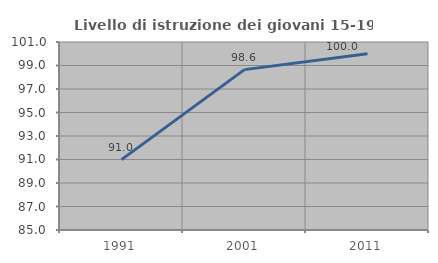
| Category | Livello di istruzione dei giovani 15-19 anni |
|---|---|
| 1991.0 | 90.991 |
| 2001.0 | 98.649 |
| 2011.0 | 100 |